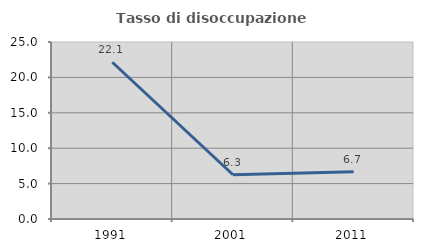
| Category | Tasso di disoccupazione giovanile  |
|---|---|
| 1991.0 | 22.137 |
| 2001.0 | 6.25 |
| 2011.0 | 6.667 |